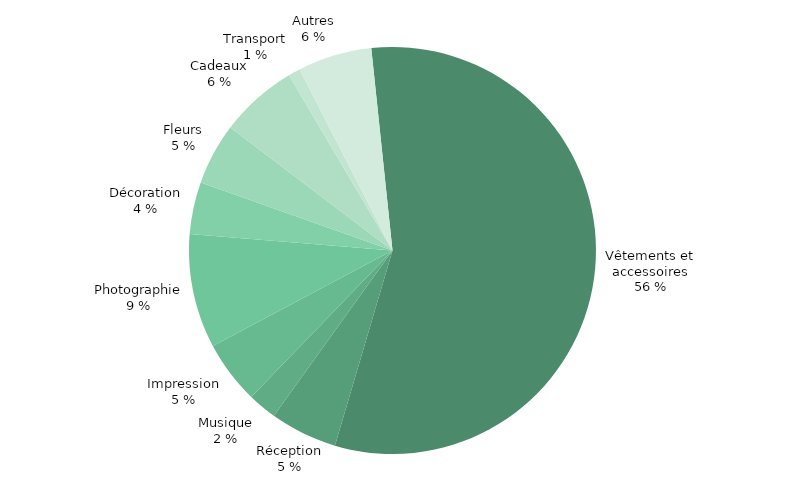
| Category | RÉEL |
|---|---|
| Vêtements et accessoires | 9770 |
| Réception | 928 |
| Musique | 400 |
| Impression | 870 |
| Photographie | 1575 |
| Décoration | 720 |
| Fleurs | 850 |
| Cadeaux | 1075 |
| Transport | 165 |
| Autres | 1021 |